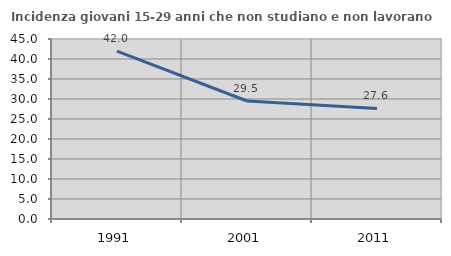
| Category | Incidenza giovani 15-29 anni che non studiano e non lavorano  |
|---|---|
| 1991.0 | 41.975 |
| 2001.0 | 29.504 |
| 2011.0 | 27.64 |